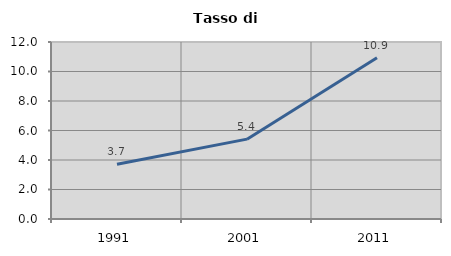
| Category | Tasso di disoccupazione   |
|---|---|
| 1991.0 | 3.715 |
| 2001.0 | 5.414 |
| 2011.0 | 10.938 |